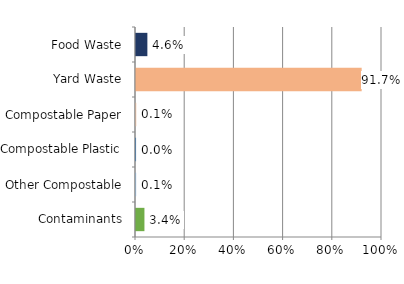
| Category | Series 0 |
|---|---|
| Contaminants | 0.034 |
| Other Compostable | 0.001 |
| Compostable Plastic | 0 |
| Compostable Paper | 0.001 |
| Yard Waste | 0.917 |
| Food Waste | 0.046 |